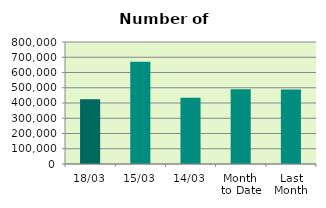
| Category | Series 0 |
|---|---|
| 18/03 | 424112 |
| 15/03 | 671244 |
| 14/03 | 434596 |
| Month 
to Date | 490859.667 |
| Last
Month | 488116.6 |